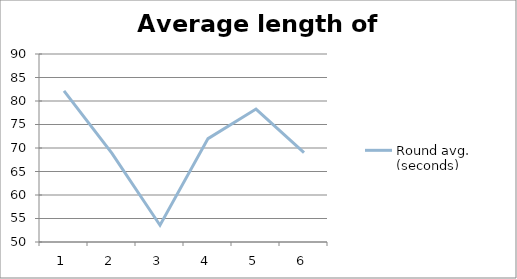
| Category | Round avg. (seconds) |
|---|---|
| 0 | 82.143 |
| 1 | 68.857 |
| 2 | 53.571 |
| 3 | 72 |
| 4 | 78.286 |
| 5 | 69 |